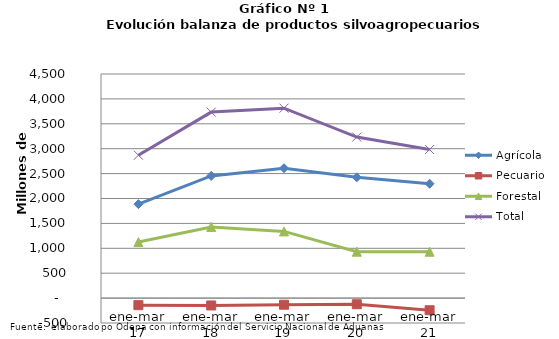
| Category | Agrícola | Pecuario | Forestal | Total |
|---|---|---|---|---|
| ene-mar 17 | 1886565 | -141795 | 1124669 | 2869439 |
| ene-mar 18 | 2453328 | -147950 | 1429548 | 3734926 |
| ene-mar 19 | 2607854 | -133164 | 1338965 | 3813655 |
| ene-mar 20 | 2425436 | -123006 | 931517 | 3233947 |
| ene-mar 21 | 2296261 | -243755 | 931093 | 2983599 |